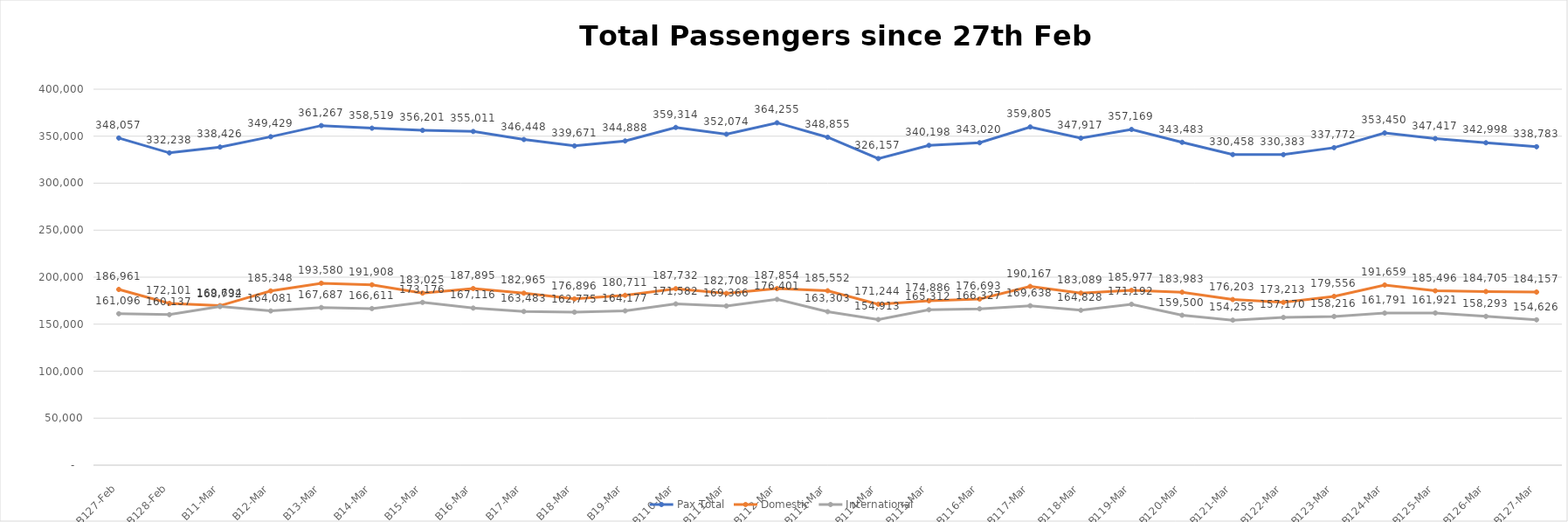
| Category | Pax Total |  Domestic  |  International  |
|---|---|---|---|
| 2023-02-27 | 348057 | 186961 | 161096 |
| 2023-02-28 | 332238 | 172101 | 160137 |
| 2023-03-01 | 338426 | 169694 | 168732 |
| 2023-03-02 | 349429 | 185348 | 164081 |
| 2023-03-03 | 361267 | 193580 | 167687 |
| 2023-03-04 | 358519 | 191908 | 166611 |
| 2023-03-05 | 356201 | 183025 | 173176 |
| 2023-03-06 | 355011 | 187895 | 167116 |
| 2023-03-07 | 346448 | 182965 | 163483 |
| 2023-03-08 | 339671 | 176896 | 162775 |
| 2023-03-09 | 344888 | 180711 | 164177 |
| 2023-03-10 | 359314 | 187732 | 171582 |
| 2023-03-11 | 352074 | 182708 | 169366 |
| 2023-03-12 | 364255 | 187854 | 176401 |
| 2023-03-13 | 348855 | 185552 | 163303 |
| 2023-03-14 | 326157 | 171244 | 154913 |
| 2023-03-15 | 340198 | 174886 | 165312 |
| 2023-03-16 | 343020 | 176693 | 166327 |
| 2023-03-17 | 359805 | 190167 | 169638 |
| 2023-03-18 | 347917 | 183089 | 164828 |
| 2023-03-19 | 357169 | 185977 | 171192 |
| 2023-03-20 | 343483 | 183983 | 159500 |
| 2023-03-21 | 330458 | 176203 | 154255 |
| 2023-03-22 | 330383 | 173213 | 157170 |
| 2023-03-23 | 337772 | 179556 | 158216 |
| 2023-03-24 | 353450 | 191659 | 161791 |
| 2023-03-25 | 347417 | 185496 | 161921 |
| 2023-03-26 | 342998 | 184705 | 158293 |
| 2023-03-27 | 338783 | 184157 | 154626 |